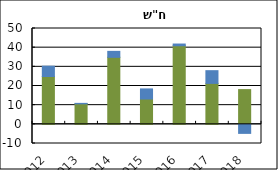
| Category | הבלאי | גידול המחזור |
|---|---|---|
| 2012.0 | 24.968 | 5.358 |
| 2013.0 | 10.706 | 0.229 |
| 2014.0 | 34.961 | 3.109 |
| 2015.0 | 13.22 | 5.259 |
| 2016.0 | 40.992 | 0.904 |
| 2017.0 | 21.356 | 6.641 |
| 2018.0 | 18.12 | -4.722 |